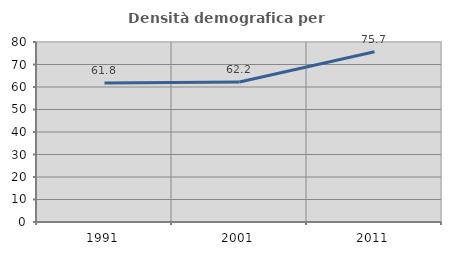
| Category | Densità demografica |
|---|---|
| 1991.0 | 61.795 |
| 2001.0 | 62.22 |
| 2011.0 | 75.657 |